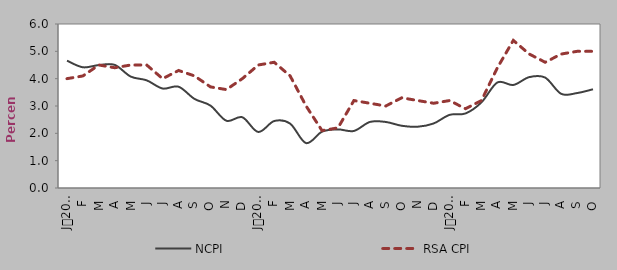
| Category | NCPI | RSA CPI |
|---|---|---|
| 0 | 4.658 | 4 |
| 1900-01-01 | 4.416 | 4.1 |
| 1900-01-02 | 4.498 | 4.5 |
| 1900-01-03 | 4.503 | 4.4 |
| 1900-01-04 | 4.076 | 4.5 |
| 1900-01-05 | 3.939 | 4.5 |
| 1900-01-06 | 3.639 | 4 |
| 1900-01-07 | 3.705 | 4.3 |
| 1900-01-08 | 3.259 | 4.1 |
| 1900-01-09 | 3.015 | 3.7 |
| 1900-01-10 | 2.461 | 3.6 |
| 1900-01-11 | 2.588 | 4 |
| 1900-01-12 | 2.05 | 4.5 |
| 1900-01-13 | 2.45 | 4.6 |
| 1900-01-14 | 2.354 | 4.1 |
| 1900-01-15 | 1.643 | 3 |
| 1900-01-16 | 2.06 | 2.1 |
| 1900-01-17 | 2.145 | 2.2 |
| 1900-01-18 | 2.087 | 3.2 |
| 1900-01-19 | 2.416 | 3.1 |
| 1900-01-20 | 2.416 | 3 |
| 1900-01-21 | 2.277 | 3.3 |
| 1900-01-22 | 2.242 | 3.2 |
| 1900-01-23 | 2.361 | 3.1 |
| 1900-01-24 | 2.676 | 3.2 |
| 1900-01-25 | 2.728 | 2.9 |
| 1900-01-26 | 3.133 | 3.2 |
| 1900-01-27 | 3.861 | 4.4 |
| 1900-01-28 | 3.769 | 5.4 |
| 1900-01-29 | 4.057 | 4.9 |
| 1900-01-30 | 4.038 | 4.6 |
| 1900-01-31 | 3.445 | 4.9 |
| 1900-02-01 | 3.474 | 5 |
| 1900-02-02 | 3.612 | 5 |